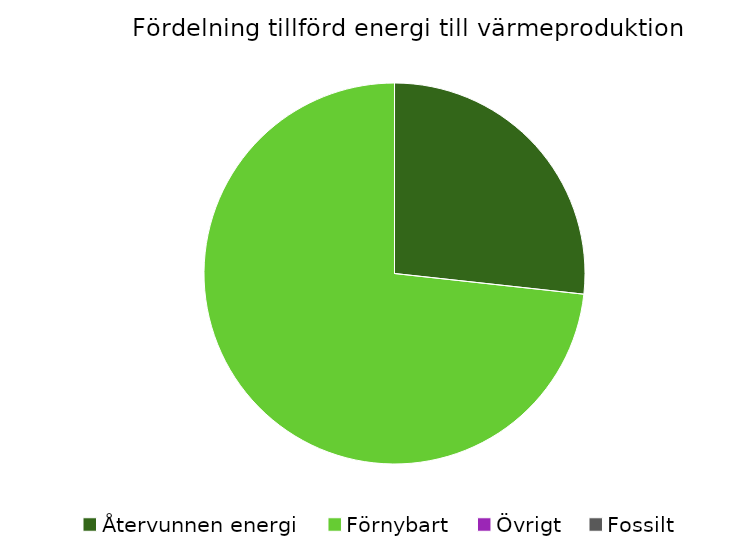
| Category | Fördelning värmeproduktion |
|---|---|
| Återvunnen energi | 0.267 |
| Förnybart | 0.733 |
| Övrigt | 0 |
| Fossilt | 0 |